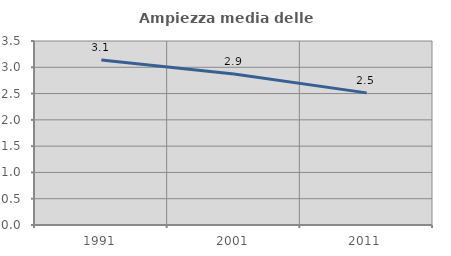
| Category | Ampiezza media delle famiglie |
|---|---|
| 1991.0 | 3.137 |
| 2001.0 | 2.873 |
| 2011.0 | 2.513 |